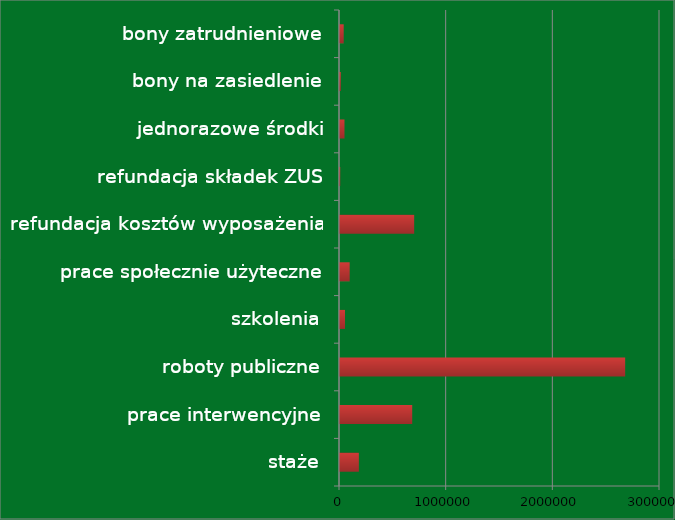
| Category | Series 0 |
|---|---|
| staże | 176787 |
| prace interwencyjne | 676986 |
| roboty publiczne | 2673458 |
| szkolenia | 47057 |
| prace społecznie użyteczne | 90700 |
| refundacja kosztów wyposażenia | 695447 |
| refundacja składek ZUS | 2201 |
| jednorazowe środki | 42000 |
| bony na zasiedlenie | 7200 |
| bony zatrudnieniowe | 34664 |